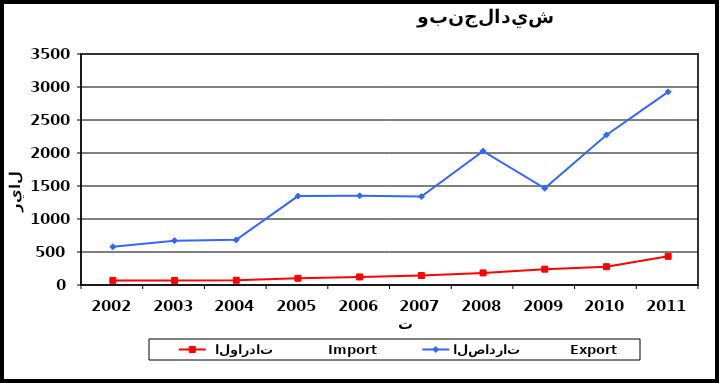
| Category |  الواردات           Import | الصادرات          Export |
|---|---|---|
| 2002.0 | 70 | 580 |
| 2003.0 | 69 | 672 |
| 2004.0 | 72 | 684 |
| 2005.0 | 102 | 1347 |
| 2006.0 | 122 | 1352 |
| 2007.0 | 143 | 1340 |
| 2008.0 | 183 | 2028 |
| 2009.0 | 240 | 1465 |
| 2010.0 | 277 | 2274 |
| 2011.0 | 435 | 2926 |